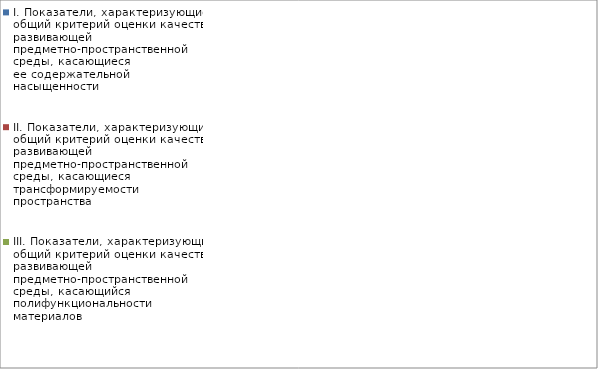
| Category | I. Показатели, характеризующие общий критерий оценки качества развивающей предметно-пространственной среды, касающиеся ее содержательной насыщенности | II. Показатели, характеризующие общий критерий оценки качества развивающей предметно-пространственной среды, касающиеся трансформируемости пространства | III. Показатели, характеризующие общий критерий оценки качества развивающей предметно-пространственной среды, касающийся полифункциональности материалов | IV. Показатели, характеризующие общий критерий оценки качества развивающей предметно-пространственной среды, касающиеся ее вариативности | V. Показатели, характеризующие общий критерий оценки качества развивающей предметно-пространственной среды, касающиеся ее доступности | VI. Показатели, характеризующие общий критерий оценки качества развивающей предметно-пространственной среды, касающиеся безопасности предметно-пространственной среды |
|---|---|---|---|---|---|---|
| Колобок | 0.955 | 0.833 | 0.833 | 0.833 | 1 | 0.95 |